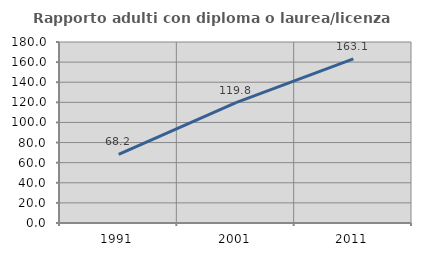
| Category | Rapporto adulti con diploma o laurea/licenza media  |
|---|---|
| 1991.0 | 68.226 |
| 2001.0 | 119.767 |
| 2011.0 | 163.13 |